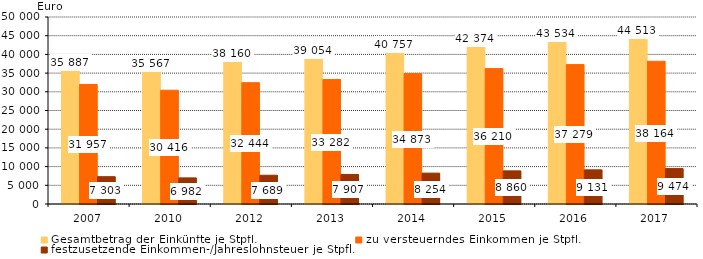
| Category | Gesamtbetrag der Einkünfte je Stpfl. | zu versteuerndes Einkommen je Stpfl. | festzusetzende Einkommen-/Jahreslohnsteuer je Stpfl. |
|---|---|---|---|
| 2007.0 | 35887 | 31957 | 7303 |
| 2010.0 | 35567 | 30416 | 6982 |
| 2012.0 | 38160 | 32444 | 7689 |
| 2013.0 | 39054 | 33282 | 7907 |
| 2014.0 | 40757 | 34873 | 8254 |
| 2015.0 | 42374 | 36210 | 8860 |
| 2016.0 | 43534 | 37279 | 9131 |
| 2017.0 | 44513 | 38164 | 9474 |